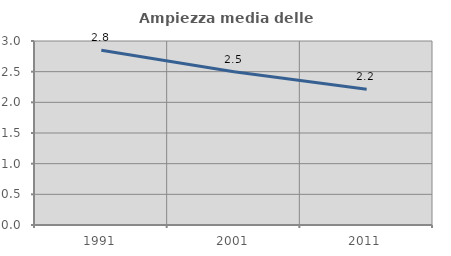
| Category | Ampiezza media delle famiglie |
|---|---|
| 1991.0 | 2.848 |
| 2001.0 | 2.5 |
| 2011.0 | 2.212 |